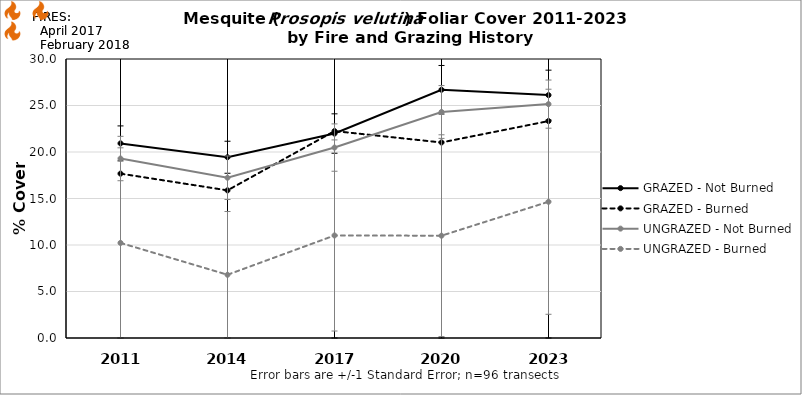
| Category | GRAZED - Not Burned | GRAZED - Burned | UNGRAZED - Not Burned | UNGRAZED - Burned |
|---|---|---|---|---|
| 2011.0 | 20.926 | 17.675 | 19.298 | 10.225 |
| 2014.0 | 19.436 | 15.875 | 17.232 | 6.8 |
| 2017.0 | 21.985 | 22.25 | 20.476 | 11.025 |
| 2020.0 | 26.694 | 21.025 | 24.304 | 11 |
| 2023.0 | 26.117 | 23.325 | 25.149 | 14.65 |